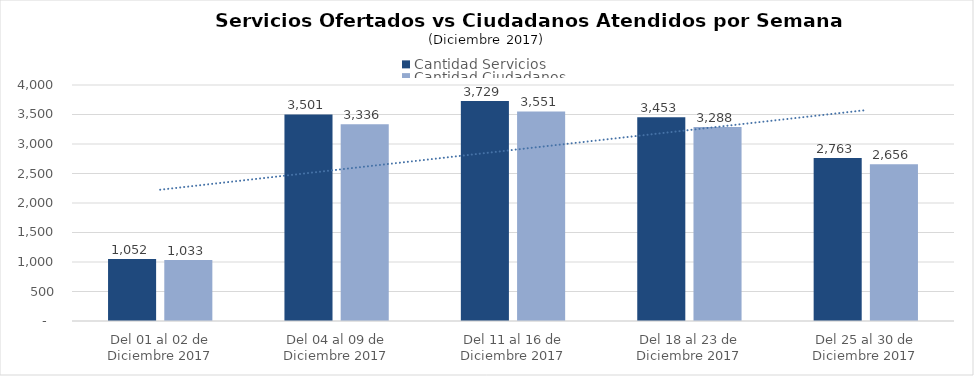
| Category | Cantidad Servicios | Cantidad Ciudadanos |
|---|---|---|
| Del 01 al 02 de Diciembre 2017 | 1052 | 1033 |
| Del 04 al 09 de Diciembre 2017 | 3501 | 3336 |
| Del 11 al 16 de Diciembre 2017 | 3729 | 3551 |
| Del 18 al 23 de Diciembre 2017 | 3453 | 3288 |
| Del 25 al 30 de Diciembre 2017 | 2763 | 2656 |